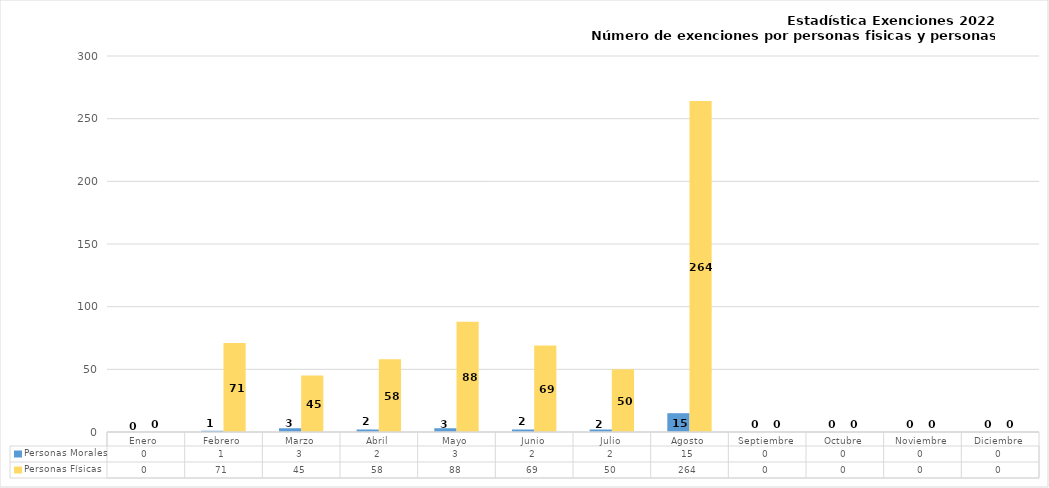
| Category | Personas Morales | Personas Físicas |
|---|---|---|
| Enero  | 0 | 0 |
| Febrero | 1 | 71 |
| Marzo | 3 | 45 |
| Abril | 2 | 58 |
| Mayo | 3 | 88 |
| Junio | 2 | 69 |
| Julio | 2 | 50 |
| Agosto | 15 | 264 |
| Septiembre | 0 | 0 |
| Octubre | 0 | 0 |
| Noviembre | 0 | 0 |
| Diciembre | 0 | 0 |